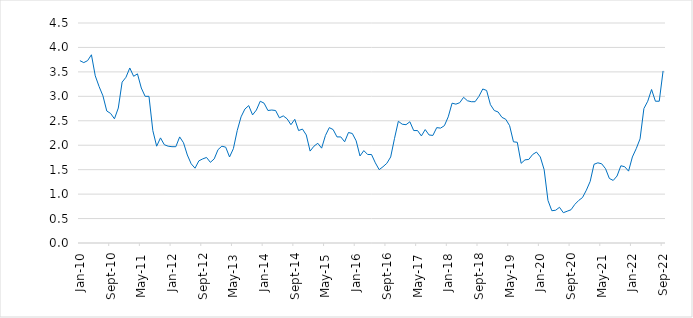
| Category | Series 0 |
|---|---|
| 2010-01-01 | 3.73 |
| 2010-02-01 | 3.69 |
| 2010-03-01 | 3.73 |
| 2010-04-01 | 3.85 |
| 2010-05-01 | 3.42 |
| 2010-06-01 | 3.2 |
| 2010-07-01 | 3.01 |
| 2010-08-01 | 2.7 |
| 2010-09-01 | 2.65 |
| 2010-10-01 | 2.54 |
| 2010-11-01 | 2.76 |
| 2010-12-01 | 3.29 |
| 2011-01-01 | 3.39 |
| 2011-02-01 | 3.58 |
| 2011-03-01 | 3.41 |
| 2011-04-01 | 3.46 |
| 2011-05-01 | 3.17 |
| 2011-06-01 | 3 |
| 2011-07-01 | 3 |
| 2011-08-01 | 2.3 |
| 2011-09-01 | 1.98 |
| 2011-10-01 | 2.15 |
| 2011-11-01 | 2.01 |
| 2011-12-01 | 1.98 |
| 2012-01-01 | 1.97 |
| 2012-02-01 | 1.97 |
| 2012-03-01 | 2.17 |
| 2012-04-01 | 2.05 |
| 2012-05-01 | 1.8 |
| 2012-06-01 | 1.62 |
| 2012-07-01 | 1.53 |
| 2012-08-01 | 1.68 |
| 2012-09-01 | 1.72 |
| 2012-10-01 | 1.75 |
| 2012-11-01 | 1.65 |
| 2012-12-01 | 1.72 |
| 2013-01-01 | 1.91 |
| 2013-02-01 | 1.98 |
| 2013-03-01 | 1.96 |
| 2013-04-01 | 1.76 |
| 2013-05-01 | 1.93 |
| 2013-06-01 | 2.3 |
| 2013-07-01 | 2.58 |
| 2013-08-01 | 2.74 |
| 2013-09-01 | 2.81 |
| 2013-10-01 | 2.62 |
| 2013-11-01 | 2.72 |
| 2013-12-01 | 2.9 |
| 2014-01-01 | 2.86 |
| 2014-02-01 | 2.71 |
| 2014-03-01 | 2.72 |
| 2014-04-01 | 2.71 |
| 2014-05-01 | 2.56 |
| 2014-06-01 | 2.6 |
| 2014-07-01 | 2.54 |
| 2014-08-01 | 2.42 |
| 2014-09-01 | 2.53 |
| 2014-10-01 | 2.3 |
| 2014-11-01 | 2.33 |
| 2014-12-01 | 2.21 |
| 2015-01-01 | 1.88 |
| 2015-02-01 | 1.98 |
| 2015-03-01 | 2.04 |
| 2015-04-01 | 1.94 |
| 2015-05-01 | 2.2 |
| 2015-06-01 | 2.36 |
| 2015-07-01 | 2.32 |
| 2015-08-01 | 2.17 |
| 2015-09-01 | 2.17 |
| 2015-10-01 | 2.07 |
| 2015-11-01 | 2.26 |
| 2015-12-01 | 2.24 |
| 2016-01-01 | 2.09 |
| 2016-02-01 | 1.78 |
| 2016-03-01 | 1.89 |
| 2016-04-01 | 1.81 |
| 2016-05-01 | 1.81 |
| 2016-06-01 | 1.64 |
| 2016-07-01 | 1.5 |
| 2016-08-01 | 1.56 |
| 2016-09-01 | 1.63 |
| 2016-10-01 | 1.76 |
| 2016-11-01 | 2.14 |
| 2016-12-01 | 2.49 |
| 2017-01-01 | 2.43 |
| 2017-02-01 | 2.42 |
| 2017-03-01 | 2.48 |
| 2017-04-01 | 2.3 |
| 2017-05-01 | 2.3 |
| 2017-06-01 | 2.19 |
| 2017-07-01 | 2.32 |
| 2017-08-01 | 2.21 |
| 2017-09-01 | 2.2 |
| 2017-10-01 | 2.36 |
| 2017-11-01 | 2.35 |
| 2017-12-01 | 2.4 |
| 2018-01-01 | 2.58 |
| 2018-02-01 | 2.86 |
| 2018-03-01 | 2.84 |
| 2018-04-01 | 2.87 |
| 2018-05-01 | 2.98 |
| 2018-06-01 | 2.91 |
| 2018-07-01 | 2.89 |
| 2018-08-01 | 2.89 |
| 2018-09-01 | 3 |
| 2018-10-01 | 3.15 |
| 2018-11-01 | 3.12 |
| 2018-12-01 | 2.83 |
| 2019-01-01 | 2.71 |
| 2019-02-01 | 2.68 |
| 2019-03-01 | 2.57 |
| 2019-04-01 | 2.53 |
| 2019-05-01 | 2.4 |
| 2019-06-01 | 2.07 |
| 2019-07-01 | 2.06 |
| 2019-08-01 | 1.63 |
| 2019-09-01 | 1.7 |
| 2019-10-01 | 1.71 |
| 2019-11-01 | 1.81 |
| 2019-12-01 | 1.86 |
| 2020-01-01 | 1.76 |
| 2020-02-01 | 1.5 |
| 2020-03-01 | 0.87 |
| 2020-04-01 | 0.66 |
| 2020-05-01 | 0.67 |
| 2020-06-01 | 0.73 |
| 2020-07-01 | 0.62 |
| 2020-08-01 | 0.65 |
| 2020-09-01 | 0.68 |
| 2020-10-01 | 0.79 |
| 2020-11-01 | 0.87 |
| 2020-12-01 | 0.93 |
| 2021-01-01 | 1.08 |
| 2021-02-01 | 1.26 |
| 2021-03-01 | 1.61 |
| 2021-04-01 | 1.64 |
| 2021-05-01 | 1.62 |
| 2021-06-01 | 1.52 |
| 2021-07-01 | 1.32 |
| 2021-08-01 | 1.28 |
| 2021-09-01 | 1.37 |
| 2021-10-01 | 1.58 |
| 2021-11-01 | 1.56 |
| 2021-12-01 | 1.47 |
| 2022-01-01 | 1.76 |
| 2022-02-01 | 1.93 |
| 2022-03-01 | 2.13 |
| 2022-04-01 | 2.75 |
| 2022-05-01 | 2.9 |
| 2022-06-01 | 3.14 |
| 2022-07-01 | 2.9 |
| 2022-08-01 | 2.9 |
| 2022-09-01 | 3.52 |